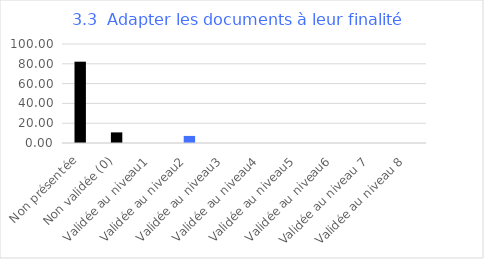
| Category | Series 0 |
|---|---|
| Non présentée | 82.143 |
| Non validée (0) | 10.714 |
| Validée au niveau1 | 0 |
| Validée au niveau2 | 7.143 |
| Validée au niveau3 | 0 |
| Validée au niveau4 | 0 |
| Validée au niveau5 | 0 |
| Validée au niveau6 | 0 |
| Validée au niveau 7 | 0 |
| Validée au niveau 8 | 0 |